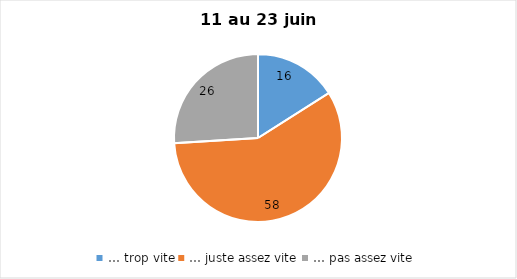
| Category | Series 0 |
|---|---|
| … trop vite | 16 |
| … juste assez vite | 58 |
| … pas assez vite | 26 |